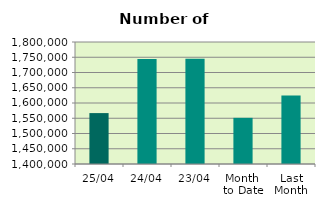
| Category | Series 0 |
|---|---|
| 25/04 | 1566916 |
| 24/04 | 1744068 |
| 23/04 | 1744824 |
| Month 
to Date | 1551344.941 |
| Last
Month | 1624932.286 |